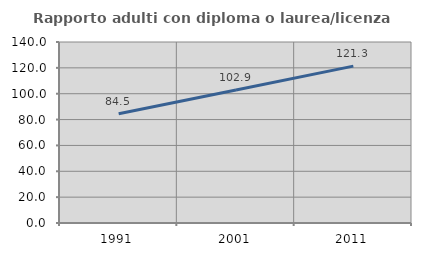
| Category | Rapporto adulti con diploma o laurea/licenza media  |
|---|---|
| 1991.0 | 84.514 |
| 2001.0 | 102.855 |
| 2011.0 | 121.348 |